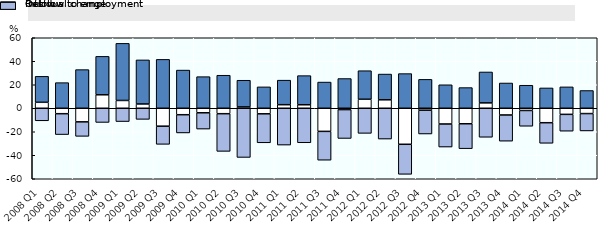
| Category | Residual change | Inflow | Outflow to employment |
|---|---|---|---|
| 2008 Q1 | 5.078 | 22.1 | -10.678 |
| 2008 Q2 | -4.64 | 21.8 | -17.76 |
| 2008 Q3 | -11.591 | 32.9 | -12.309 |
| 2008 Q4 | 11.472 | 32.7 | -12.072 |
| 2009 Q1 | 6.628 | 48.6 | -11.328 |
| 2009 Q2 | 3.652 | 37.5 | -9.452 |
| 2009 Q3 | -15.263 | 41.6 | -15.437 |
| 2009 Q4 | -5.498 | 32.5 | -15.502 |
| 2010 Q1 | -3.845 | 26.9 | -13.855 |
| 2010 Q2 | -4.629 | 28.1 | -32.071 |
| 2010 Q3 | 1.151 | 22.7 | -41.851 |
| 2010 Q4 | -4.745 | 18.2 | -24.655 |
| 2011 Q1 | 3.019 | 20.9 | -31.319 |
| 2011 Q2 | 2.976 | 24.8 | -29.376 |
| 2011 Q3 | -19.675 | 22.3 | -24.525 |
| 2011 Q4 | -1.151 | 25.3 | -24.549 |
| 2012 Q1 | 7.663 | 24.3 | -21.363 |
| 2012 Q2 | 7.207 | 21.9 | -26.207 |
| 2012 Q3 | -30.662 | 29.5 | -25.538 |
| 2012 Q4 | -1.63 | 24.6 | -20.27 |
| 2013 Q1 | -13.417 | 20 | -19.583 |
| 2013 Q2 | -13.195 | 17.6 | -21.205 |
| 2013 Q3 | 4.58 | 26.3 | -24.68 |
| 2013 Q4 | -5.741 | 21.5 | -22.259 |
| 2014 Q1 | -1.888 | 19.6 | -13.412 |
| 2014 Q2 | -12.306 | 17.3 | -17.494 |
| 2014 Q3 | -5.195 | 18.2 | -14.305 |
| 2014 Q4 | -4.527 | 15.1 | -14.773 |